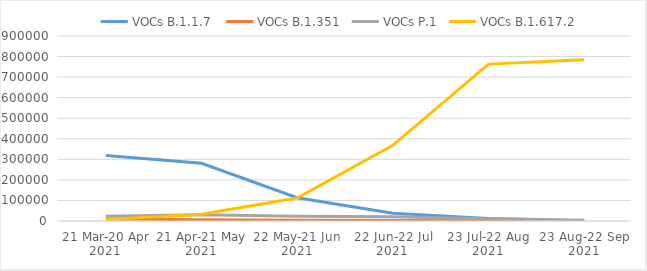
| Category | VOCs |
|---|---|
| 21 Mar-20 Apr 2021 | 7598 |
| 21 Apr-21 May 2021 | 32470 |
| 22 May-21 Jun 2021 | 111557 |
| 22 Jun-22 Jul 2021 | 367894 |
| 23 Jul-22 Aug 2021 | 763225 |
| 23 Aug-22 Sep 2021 | 784281 |